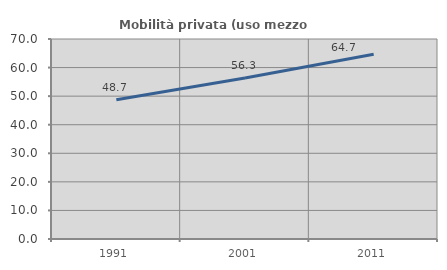
| Category | Mobilità privata (uso mezzo privato) |
|---|---|
| 1991.0 | 48.725 |
| 2001.0 | 56.348 |
| 2011.0 | 64.656 |